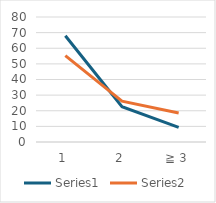
| Category | Series 0 | Series 1 |
|---|---|---|
| 1 | 68.03 | 55.273 |
| 2 | 22.633 | 26.116 |
| ≧ 3 | 9.32 | 18.611 |